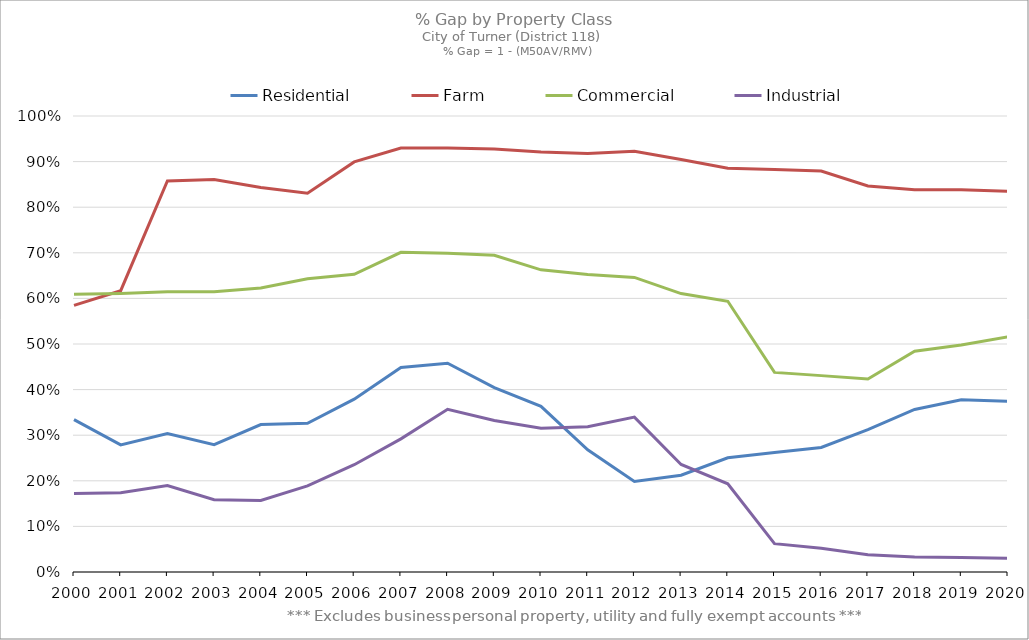
| Category | Residential | Farm | Commercial | Industrial |
|---|---|---|---|---|
| 2000.0 | 0.334 | 0.585 | 0.609 | 0.172 |
| 2001.0 | 0.279 | 0.617 | 0.611 | 0.174 |
| 2002.0 | 0.304 | 0.858 | 0.614 | 0.19 |
| 2003.0 | 0.279 | 0.86 | 0.614 | 0.158 |
| 2004.0 | 0.323 | 0.843 | 0.623 | 0.157 |
| 2005.0 | 0.326 | 0.831 | 0.643 | 0.189 |
| 2006.0 | 0.379 | 0.899 | 0.653 | 0.235 |
| 2007.0 | 0.449 | 0.93 | 0.701 | 0.292 |
| 2008.0 | 0.458 | 0.93 | 0.699 | 0.357 |
| 2009.0 | 0.404 | 0.927 | 0.695 | 0.332 |
| 2010.0 | 0.363 | 0.921 | 0.663 | 0.315 |
| 2011.0 | 0.268 | 0.918 | 0.652 | 0.318 |
| 2012.0 | 0.199 | 0.923 | 0.646 | 0.34 |
| 2013.0 | 0.212 | 0.904 | 0.611 | 0.236 |
| 2014.0 | 0.25 | 0.885 | 0.594 | 0.193 |
| 2015.0 | 0.262 | 0.882 | 0.438 | 0.062 |
| 2016.0 | 0.273 | 0.879 | 0.431 | 0.052 |
| 2017.0 | 0.312 | 0.847 | 0.423 | 0.038 |
| 2018.0 | 0.356 | 0.838 | 0.484 | 0.033 |
| 2019.0 | 0.378 | 0.838 | 0.498 | 0.032 |
| 2020.0 | 0.375 | 0.835 | 0.516 | 0.03 |